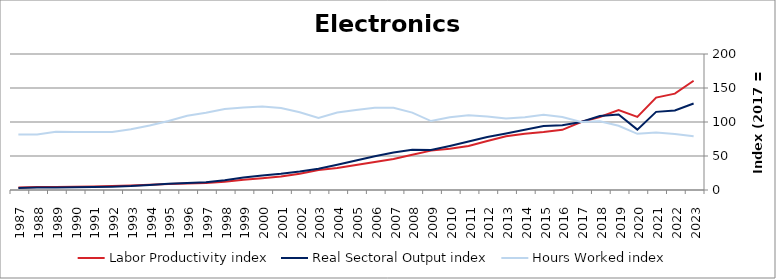
| Category | Labor Productivity index | Real Sectoral Output index | Hours Worked index |
|---|---|---|---|
| 2023.0 | 160.659 | 127.253 | 79.207 |
| 2022.0 | 141.746 | 116.954 | 82.51 |
| 2021.0 | 135.935 | 114.907 | 84.531 |
| 2020.0 | 107.522 | 88.81 | 82.597 |
| 2019.0 | 117.648 | 111.072 | 94.41 |
| 2018.0 | 107.468 | 108.729 | 101.174 |
| 2017.0 | 100 | 100 | 100 |
| 2016.0 | 88.5 | 95.086 | 107.442 |
| 2015.0 | 85.142 | 94.073 | 110.489 |
| 2014.0 | 82.876 | 88.627 | 106.939 |
| 2013.0 | 78.986 | 83.186 | 105.317 |
| 2012.0 | 72.021 | 77.901 | 108.164 |
| 2011.0 | 64.859 | 71.329 | 109.977 |
| 2010.0 | 60.616 | 64.799 | 106.901 |
| 2009.0 | 57.9 | 58.691 | 101.365 |
| 2008.0 | 51.963 | 59.161 | 113.852 |
| 2007.0 | 45.69 | 55.236 | 120.893 |
| 2006.0 | 41.137 | 49.7 | 120.815 |
| 2005.0 | 36.732 | 43.258 | 117.767 |
| 2004.0 | 32.506 | 37.044 | 113.961 |
| 2003.0 | 29.548 | 31.313 | 105.972 |
| 2002.0 | 23.807 | 27.207 | 114.28 |
| 2001.0 | 19.824 | 23.91 | 120.611 |
| 2000.0 | 17.452 | 21.399 | 122.615 |
| 1999.0 | 15.027 | 18.251 | 121.454 |
| 1998.0 | 12.178 | 14.499 | 119.058 |
| 1997.0 | 10.146 | 11.518 | 113.522 |
| 1996.0 | 9.433 | 10.303 | 109.219 |
| 1995.0 | 8.92 | 9.042 | 101.37 |
| 1994.0 | 7.825 | 7.42 | 94.82 |
| 1993.0 | 6.519 | 5.816 | 89.216 |
| 1992.0 | 5.747 | 4.894 | 85.166 |
| 1991.0 | 5.161 | 4.401 | 85.275 |
| 1990.0 | 4.802 | 4.103 | 85.434 |
| 1989.0 | 4.466 | 3.833 | 85.819 |
| 1988.0 | 4.315 | 3.519 | 81.571 |
| 1987.0 | 3.68 | 3.003 | 81.598 |